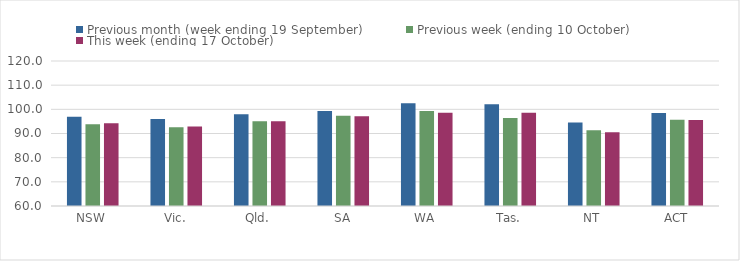
| Category | Previous month (week ending 19 September) | Previous week (ending 10 October) | This week (ending 17 October) |
|---|---|---|---|
| NSW | 96.98 | 93.78 | 94.19 |
| Vic. | 95.95 | 92.58 | 92.92 |
| Qld. | 98.01 | 95.12 | 95.11 |
| SA | 99.33 | 97.36 | 97.11 |
| WA | 102.54 | 99.31 | 98.62 |
| Tas. | 102.09 | 96.42 | 98.62 |
| NT | 94.57 | 91.32 | 90.56 |
| ACT | 98.5 | 95.69 | 95.62 |